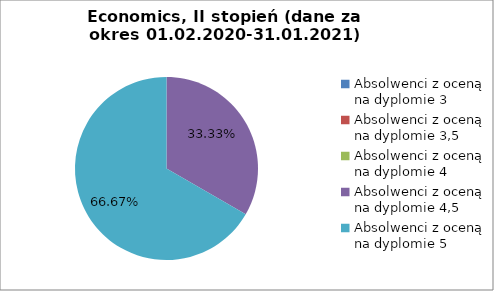
| Category | Series 0 |
|---|---|
| Absolwenci z oceną na dyplomie 3 | 0 |
| Absolwenci z oceną na dyplomie 3,5 | 0 |
| Absolwenci z oceną na dyplomie 4 | 0 |
| Absolwenci z oceną na dyplomie 4,5 | 33.333 |
| Absolwenci z oceną na dyplomie 5 | 66.667 |